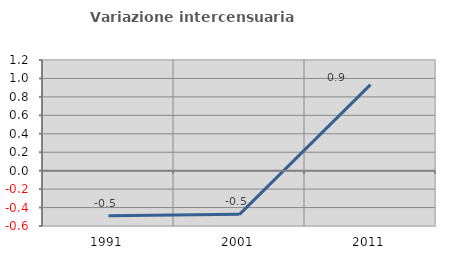
| Category | Variazione intercensuaria annua |
|---|---|
| 1991.0 | -0.489 |
| 2001.0 | -0.474 |
| 2011.0 | 0.933 |